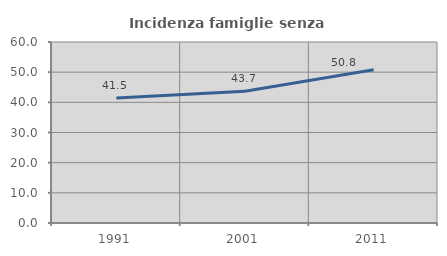
| Category | Incidenza famiglie senza nuclei |
|---|---|
| 1991.0 | 41.463 |
| 2001.0 | 43.689 |
| 2011.0 | 50.811 |